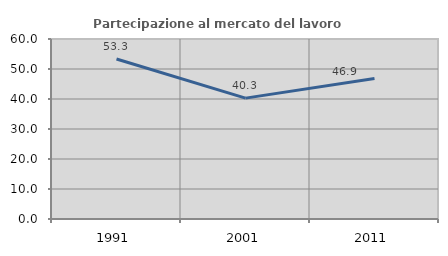
| Category | Partecipazione al mercato del lavoro  femminile |
|---|---|
| 1991.0 | 53.347 |
| 2001.0 | 40.295 |
| 2011.0 | 46.861 |